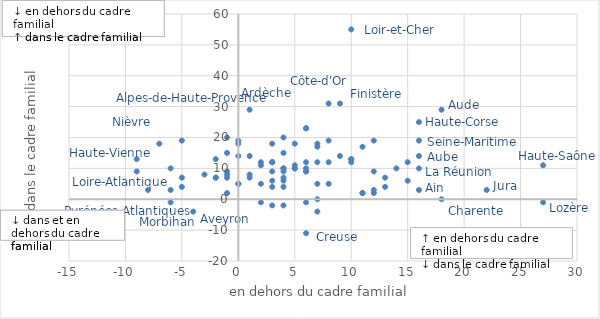
| Category | Series 0 |
|---|---|
| 16.0 | 3 |
| 11.0 | 17 |
| 6.0 | 23 |
| -5.0 | 19 |
| 3.0 | -2 |
| 8.0 | 12 |
| 1.0 | 29 |
| 1.0 | 8 |
| 15.0 | 6 |
| 16.0 | 14 |
| 18.0 | 29 |
| -4.0 | -4 |
| 4.0 | 4 |
| 6.0 | 23 |
| 0.0 | 18 |
| 18.0 | 0 |
| 9.0 | 14 |
| -1.0 | 2 |
| 7.0 | 17 |
| 8.0 | 19 |
| 16.0 | 25 |
| 8.0 | 31 |
| 4.0 | 6 |
| 6.0 | -11 |
| 11.0 | 2 |
| -2.0 | 13 |
| 2.0 | 11 |
| 4.0 | 15 |
| 3.0 | 12 |
| 9.0 | 31 |
| 6.0 | 10 |
| 4.0 | 7 |
| 10.0 | 12 |
| 5.0 | 10 |
| 1.0 | 7 |
| 6.0 | 9 |
| 3.0 | 4 |
| 5.0 | 18 |
| 7.0 | 12 |
| 22.0 | 3 |
| -5.0 | 7 |
| 10.0 | 55 |
| 3.0 | 12 |
| 1.0 | 14 |
| -9.0 | 9 |
| 10.0 | 13 |
| 6.0 | 9 |
| 12.0 | 3 |
| 27.0 | -1 |
| -1.0 | 15 |
| -2.0 | 7 |
| 15.0 | 12 |
| 12.0 | 2 |
| 2.0 | 12 |
| 6.0 | -1 |
| 4.0 | 9 |
| -6.0 | -1 |
| 5.0 | 10 |
| -7.0 | 18 |
| 4.0 | 10 |
| 12.0 | 19 |
| 0.0 | 19 |
| 13.0 | 7 |
| 10.0 | 13 |
| -8.0 | 3 |
| -1.0 | 9 |
| 5.0 | 11 |
| 8.0 | 5 |
| -1.0 | 7 |
| -5.0 | 4 |
| 27.0 | 11 |
| 3.0 | 12 |
| 6.0 | 12 |
| 4.0 | 20 |
| 13.0 | 4 |
| -6.0 | 10 |
| 16.0 | 19 |
| 3.0 | 9 |
| 7.0 | 5 |
| 0.0 | 5 |
| 7.0 | 18 |
| 0.0 | 5 |
| -1.0 | 20 |
| -1.0 | 8 |
| 2.0 | 5 |
| 12.0 | 9 |
| -3.0 | 8 |
| -9.0 | 13 |
| 3.0 | 18 |
| -2.0 | 7 |
| 2.0 | -1 |
| 14.0 | 10 |
| 11.0 | 2 |
| 7.0 | 0 |
| 3.0 | 6 |
| 4.0 | 10 |
| 4.0 | -2 |
| 0.0 | 14 |
| -6.0 | 3 |
| 16.0 | 10 |
| 7.0 | -4 |